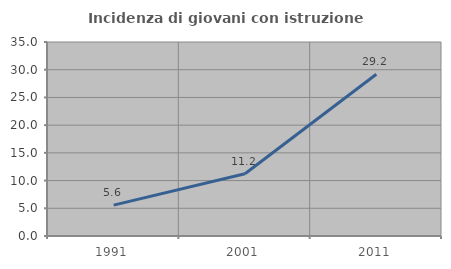
| Category | Incidenza di giovani con istruzione universitaria |
|---|---|
| 1991.0 | 5.565 |
| 2001.0 | 11.226 |
| 2011.0 | 29.182 |